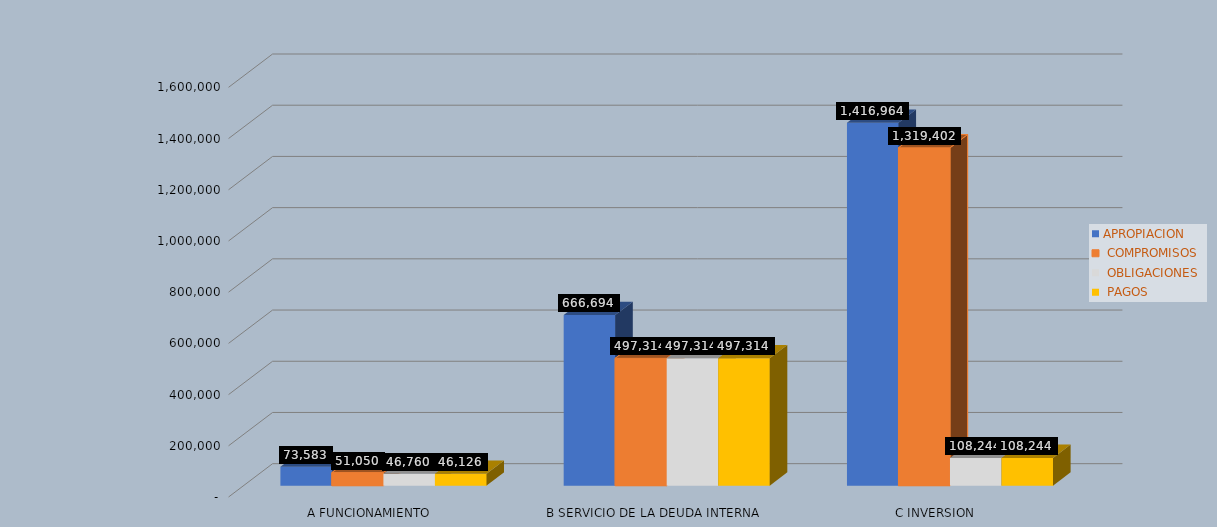
| Category | APROPIACION |  COMPROMISOS |  OBLIGACIONES |  PAGOS |
|---|---|---|---|---|
| A FUNCIONAMIENTO | 73583.024 | 51049.683 | 46759.634 | 46126.099 |
| B SERVICIO DE LA DEUDA INTERNA | 666693.529 | 497313.883 | 497313.883 | 497313.883 |
| C INVERSION | 1416964.092 | 1319401.97 | 108244.06 | 108244.06 |